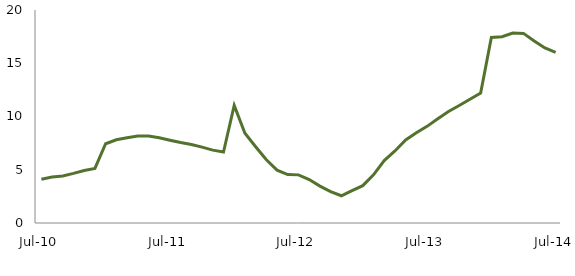
| Category | Series 0 |
|---|---|
| Jul-10 | 4.112 |
|  | 4.321 |
|  | 4.42 |
|  | 4.657 |
|  | 4.929 |
|  | 5.12 |
|  | 7.444 |
|  | 7.818 |
|  | 8.012 |
|  | 8.161 |
|  | 8.168 |
|  | 8.004 |
| Jul-11 | 7.769 |
|  | 7.555 |
|  | 7.367 |
|  | 7.122 |
|  | 6.84 |
|  | 6.661 |
|  | 11.044 |
|  | 8.43 |
|  | 7.165 |
|  | 5.933 |
|  | 4.965 |
|  | 4.549 |
| Jul-12 | 4.519 |
|  | 4.08 |
|  | 3.461 |
|  | 2.94 |
|  | 2.557 |
|  | 3.045 |
|  | 3.508 |
|  | 4.519 |
|  | 5.862 |
|  | 6.765 |
|  | 7.803 |
|  | 8.471 |
| Jul-13 | 9.075 |
|  | 9.787 |
|  | 10.468 |
|  | 11.036 |
|  | 11.622 |
|  | 12.2 |
|  | 17.421 |
|  | 17.488 |
|  | 17.829 |
|  | 17.803 |
|  | 17.087 |
|  | 16.432 |
| Jul-14 | 16.015 |